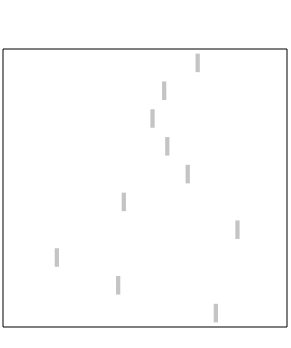
| Category | Spectrum 2 |
|---|---|
| Median Household Income (MHI) | 10 |
| Percent Below Poverty Level | 10 |
| Percent Receiving Public Assistance or SNAP | 10 |
| Percent Receiving Supplemental Security Income | 10 |
| Unemployment Rate (Primary County 12 mo avg) | 10 |
| Percent Not in Labor Force | 10 |
| Population Trend (2010-2020) | 10 |
| Percent with High School Diploma or Less | 10 |
| Percent of Vacant Homes (excl. Seasonal and Vacation) | 10 |
| Percent Housing Cost Burdened (>= 30% of Income) | 10 |